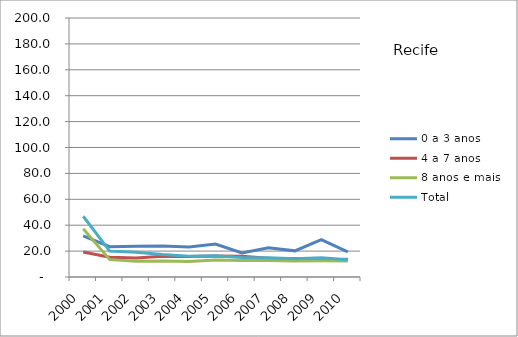
| Category | 0 a 3 anos | 4 a 7 anos | 8 anos e mais | Total |
|---|---|---|---|---|
| 2000.0 | 31.8 | 19.3 | 37.2 | 46.9 |
| 2001.0 | 23.4 | 15.2 | 13.4 | 20 |
| 2002.0 | 23.7 | 14.7 | 12.1 | 19.2 |
| 2003.0 | 24 | 16 | 12.4 | 17.3 |
| 2004.0 | 23.1 | 15.9 | 12 | 16 |
| 2005.0 | 25.5 | 16.3 | 13.1 | 16.4 |
| 2006.0 | 18.5 | 16 | 12.8 | 15.1 |
| 2007.0 | 22.6 | 14.4 | 12.8 | 14.9 |
| 2008.0 | 20.2 | 14.3 | 12.3 | 14.1 |
| 2009.0 | 28.9 | 13.1 | 12.5 | 14.9 |
| 2010.0 | 19.4 | 13.8 | 12.3 | 13.4 |